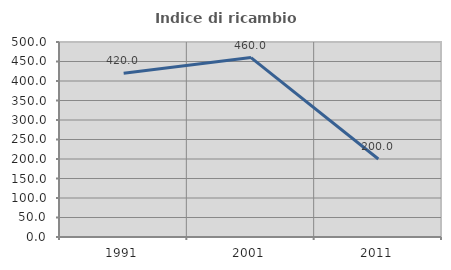
| Category | Indice di ricambio occupazionale  |
|---|---|
| 1991.0 | 420 |
| 2001.0 | 460 |
| 2011.0 | 200 |